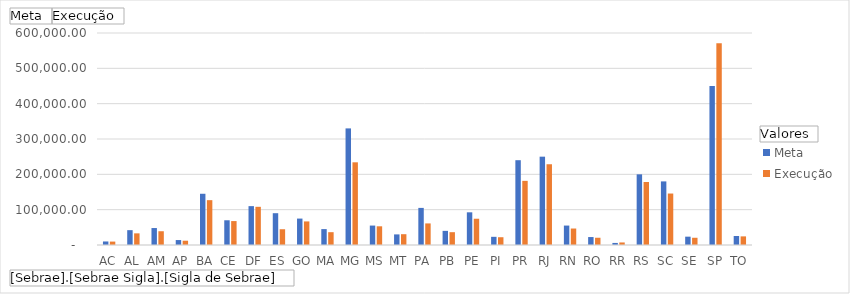
| Category | Meta | Execução |
|---|---|---|
| AC | 10000 | 9659 |
| AL | 42000 | 32964 |
| AM | 48000 | 38947 |
| AP | 14000 | 12149 |
| BA | 145000 | 126901 |
| CE | 69986 | 67708 |
| DF | 110000 | 108073 |
| ES | 90000 | 44628 |
| GO | 74782 | 66735 |
| MA | 45000 | 36277 |
| MG | 330000 | 234013 |
| MS | 55000 | 52928 |
| MT | 30000 | 30578 |
| PA | 105000 | 61074 |
| PB | 40000 | 36280 |
| PE | 92510 | 74334 |
| PI | 23149 | 22002 |
| PR | 240000 | 181558 |
| RJ | 250000 | 228551 |
| RN | 55000 | 46647 |
| RO | 22500 | 20523 |
| RR | 5842 | 7200 |
| RS | 200000 | 178319 |
| SC | 180000 | 145664 |
| SE | 23590 | 20481 |
| SP | 450000 | 570777 |
| TO | 25500 | 24399 |